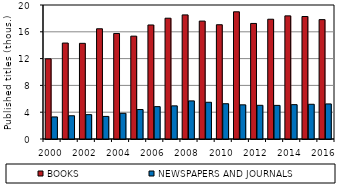
| Category | BOOKS | NEWSPAPERS AND JOURNALS |
|---|---|---|
| 2000.0 | 11.965 | 3.295 |
| 2001.0 | 14.321 | 3.469 |
| 2002.0 | 14.278 | 3.636 |
| 2003.0 | 16.451 | 3.372 |
| 2004.0 | 15.749 | 3.835 |
| 2005.0 | 15.35 | 4.399 |
| 2006.0 | 17.019 | 4.832 |
| 2007.0 | 18.029 | 4.947 |
| 2008.0 | 18.52 | 5.687 |
| 2009.0 | 17.598 | 5.481 |
| 2010.0 | 17.054 | 5.265 |
| 2011.0 | 18.985 | 5.098 |
| 2012.0 | 17.247 | 5.028 |
| 2013.0 | 17.876 | 5.017 |
| 2014.0 | 18.379 | 5.127 |
| 2015.0 | 18.282 | 5.182 |
| 2016.0 | 17.815 | 5.234 |